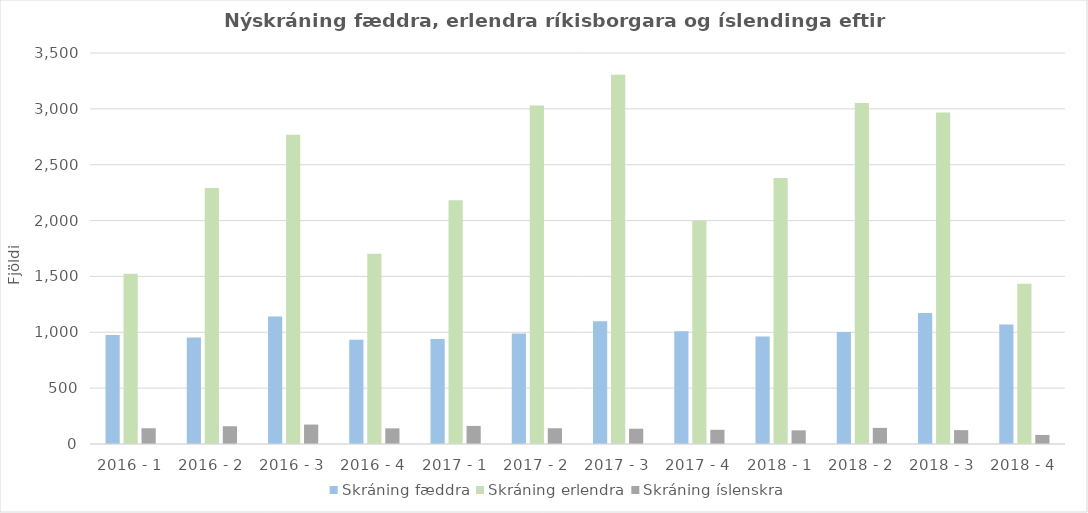
| Category | Skráning fæddra | Skráning erlendra | Skráning íslenskra |
|---|---|---|---|
| 2016 - 1 | 975 | 1524 | 141 |
| 2016 - 2 | 954 | 2291 | 159 |
| 2016 - 3 | 1142 | 2769 | 174 |
| 2016 - 4 | 934 | 1704 | 140 |
| 2017 - 1 | 939 | 2183 | 162 |
| 2017 - 2 | 990 | 3029 | 141 |
| 2017 - 3 | 1099 | 3306 | 137 |
| 2017 - 4 | 1010 | 1997 | 127 |
| 2018 - 1 | 963 | 2380 | 122 |
| 2018 - 2 | 1003 | 3052 | 144 |
| 2018 - 3 | 1172 | 2968 | 124 |
| 2018 - 4 | 1069 | 1434 | 81 |